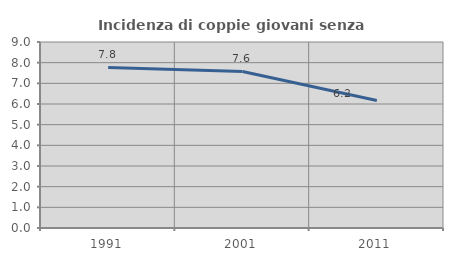
| Category | Incidenza di coppie giovani senza figli |
|---|---|
| 1991.0 | 7.767 |
| 2001.0 | 7.573 |
| 2011.0 | 6.171 |